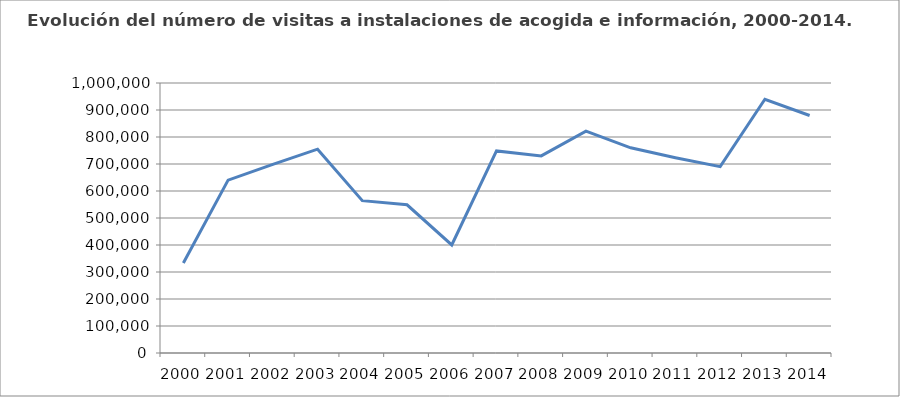
| Category | Total Andalucía |
|---|---|
| 2000.0 | 333552 |
| 2001.0 | 640353 |
| 2002.0 | 698900 |
| 2003.0 | 755005 |
| 2004.0 | 564233 |
| 2005.0 | 549011 |
| 2006.0 | 400300 |
| 2007.0 | 748312 |
| 2008.0 | 729948 |
| 2009.0 | 821634 |
| 2010.0 | 760012 |
| 2011.0 | 723276 |
| 2012.0 | 690206 |
| 2013.0 | 939779 |
| 2014.0 | 879510 |